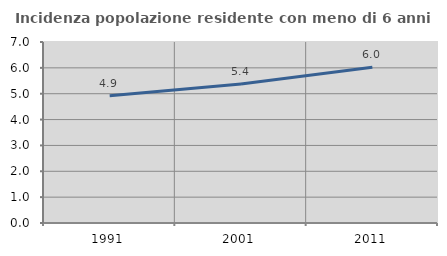
| Category | Incidenza popolazione residente con meno di 6 anni |
|---|---|
| 1991.0 | 4.922 |
| 2001.0 | 5.376 |
| 2011.0 | 6.024 |